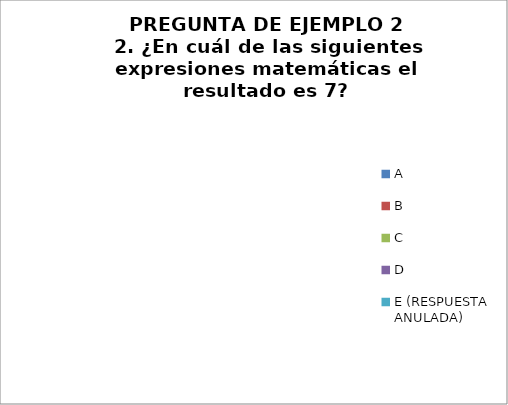
| Category | CANTIDAD DE RESPUESTAS PREGUNTA (2) | PORCENTAJE |
|---|---|---|
| A | 0 | 0 |
| B | 0 | 0 |
| C | 0 | 0 |
| D | 0 | 0 |
| E (RESPUESTA ANULADA) | 0 | 0 |